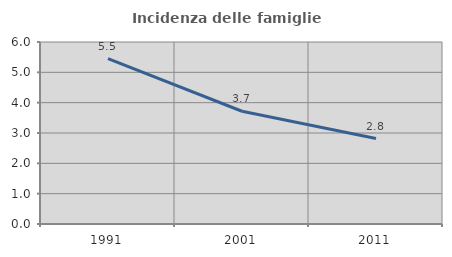
| Category | Incidenza delle famiglie numerose |
|---|---|
| 1991.0 | 5.455 |
| 2001.0 | 3.717 |
| 2011.0 | 2.817 |